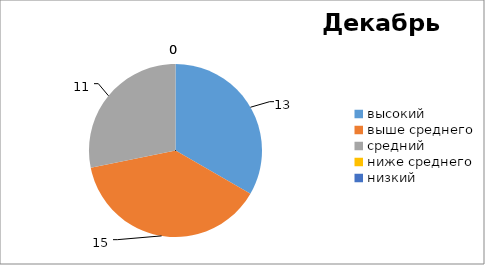
| Category | Series 1 | Series 0 |
|---|---|---|
| высокий | 13 | 18 |
| выше среднего | 15 | 12 |
| средний | 11 | 8 |
| ниже среднего | 0 | 1 |
| низкий | 0 | 0 |